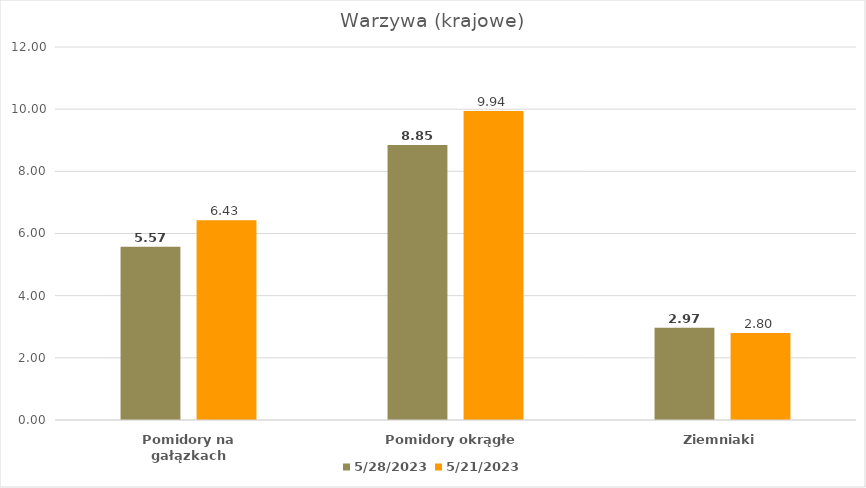
| Category | 28.05.2023 | 21.05.2023 |
|---|---|---|
| Pomidory na gałązkach | 5.57 | 6.43 |
| Pomidory okrągłe | 8.85 | 9.94 |
| Ziemniaki | 2.97 | 2.8 |